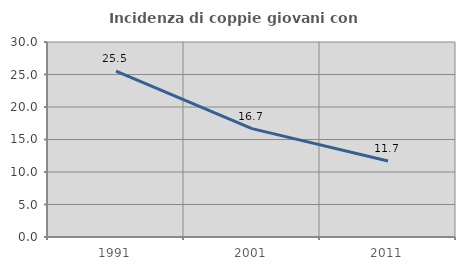
| Category | Incidenza di coppie giovani con figli |
|---|---|
| 1991.0 | 25.508 |
| 2001.0 | 16.672 |
| 2011.0 | 11.682 |